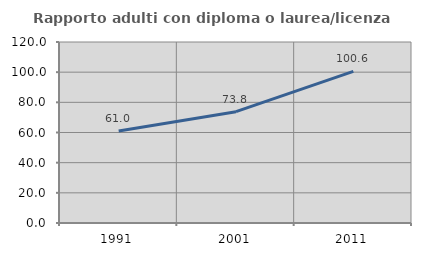
| Category | Rapporto adulti con diploma o laurea/licenza media  |
|---|---|
| 1991.0 | 61.006 |
| 2001.0 | 73.822 |
| 2011.0 | 100.568 |